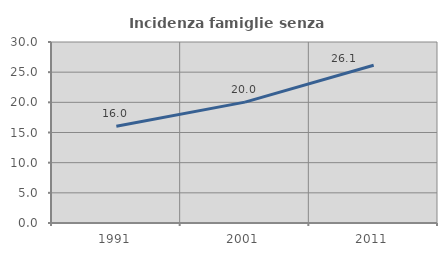
| Category | Incidenza famiglie senza nuclei |
|---|---|
| 1991.0 | 16.029 |
| 2001.0 | 20.037 |
| 2011.0 | 26.142 |